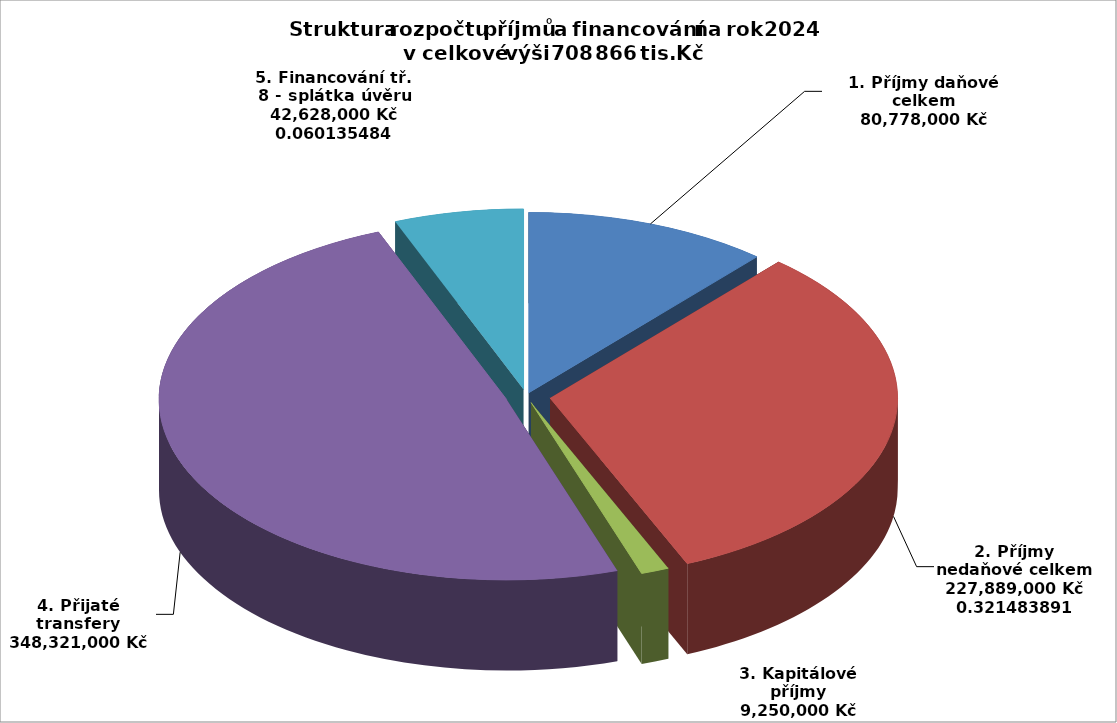
| Category | Series 0 |
|---|---|
| 1. Příjmy daňové celkem | 80778000 |
| 2. Příjmy nedaňové celkem | 227889000 |
| 3. Kapitálové příjmy | 9250000 |
| 4. Přijaté transfery | 348321000 |
| 5. Financování tř. 8 - splátka úvěru | 42628000 |